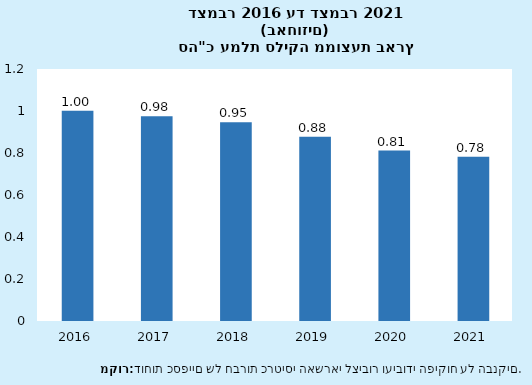
| Category | סה"כ עמלת סליקה ממוצעת |
|---|---|
| 2016-12-31 | 1.001 |
| 2017-12-31 | 0.975 |
| 2018-12-31 | 0.947 |
| 2019-12-31 | 0.878 |
| 2020-12-31 | 0.812 |
| 2021-12-31 | 0.783 |